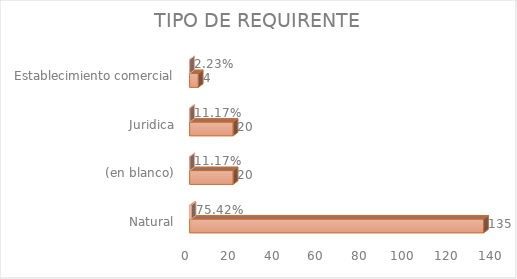
| Category | Cuenta de Número petición | Cuenta de Número petición2 |
|---|---|---|
| Natural | 135 | 0.754 |
| (en blanco) | 20 | 0.112 |
| Juridica | 20 | 0.112 |
| Establecimiento comercial | 4 | 0.022 |